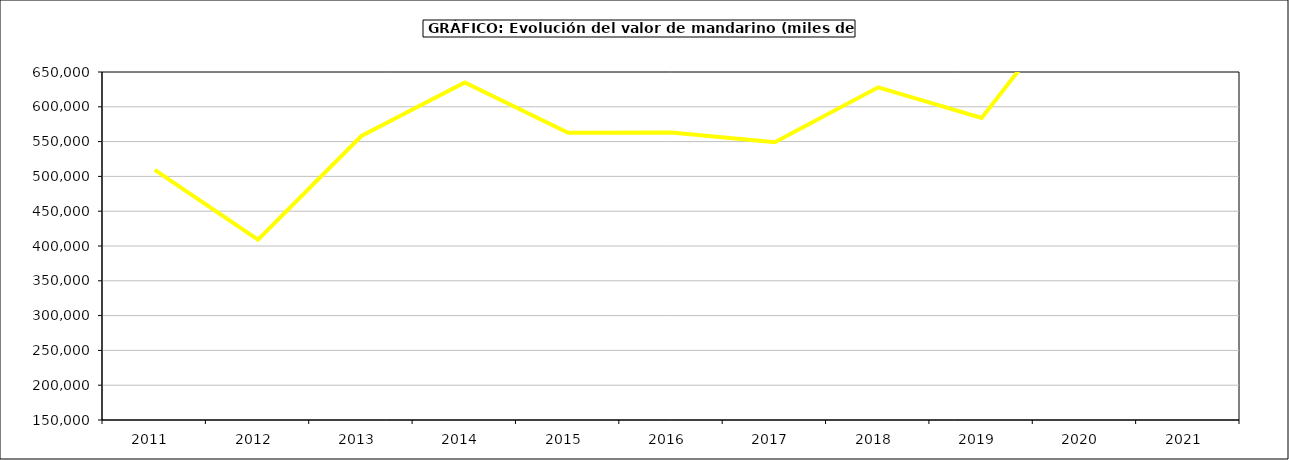
| Category | Valor |
|---|---|
| 2011.0 | 509378.831 |
| 2012.0 | 409245.656 |
| 2013.0 | 558087.419 |
| 2014.0 | 634994.836 |
| 2015.0 | 562627 |
| 2016.0 | 563122 |
| 2017.0 | 549191.426 |
| 2018.0 | 627958.978 |
| 2019.0 | 584094.488 |
| 2020.0 | 773652.644 |
| 2021.0 | 750798.993 |